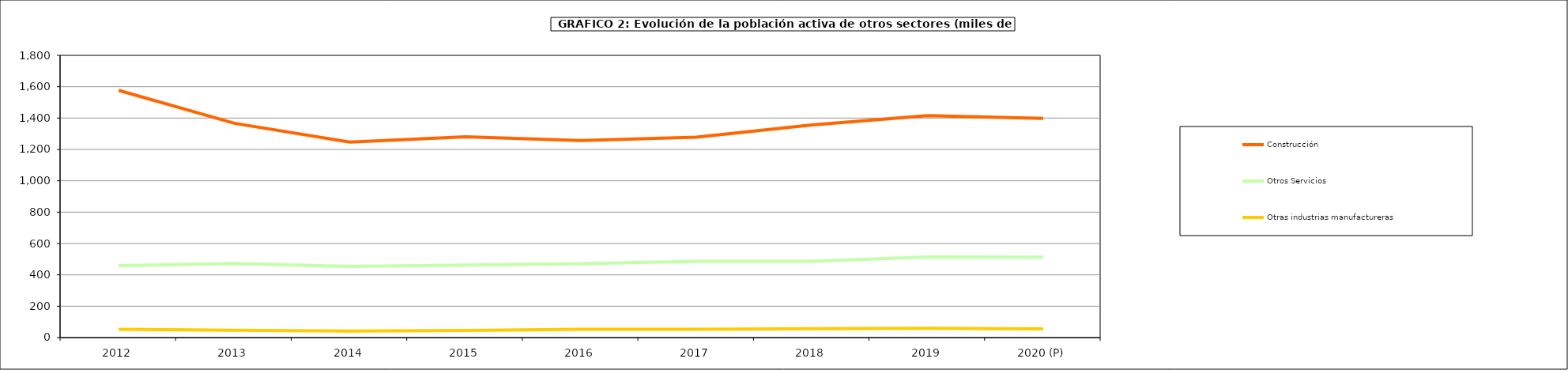
| Category | Construcción | Otros Servicios | Otras industrias manufactureras |
|---|---|---|---|
| 2012 | 1576.925 | 459.15 | 52.8 |
| 2013 | 1366.878 | 473.15 | 46.85 |
| 2014 | 1247.2 | 454.2 | 42.2 |
| 2015 | 1280.975 | 462.325 | 44.95 |
| 2016 | 1256.45 | 471.23 | 52.98 |
| 2017 | 1278.6 | 486.4 | 52.6 |
| 2018 | 1356.625 | 486.875 | 57 |
| 2019 | 1415.25 | 513.675 | 59.45 |
| 2020 (P) | 1397.5 | 513 | 55.3 |